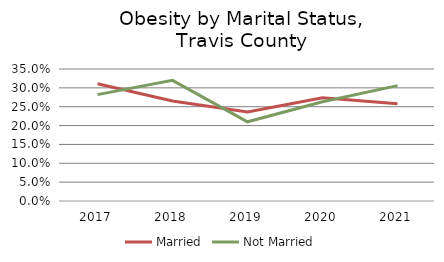
| Category | Married | Not Married |
|---|---|---|
| 2017.0 | 0.311 | 0.282 |
| 2018.0 | 0.265 | 0.32 |
| 2019.0 | 0.236 | 0.21 |
| 2020.0 | 0.274 | 0.263 |
| 2021.0 | 0.258 | 0.306 |